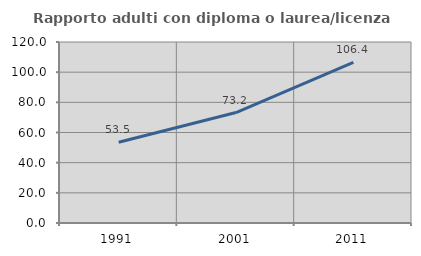
| Category | Rapporto adulti con diploma o laurea/licenza media  |
|---|---|
| 1991.0 | 53.526 |
| 2001.0 | 73.243 |
| 2011.0 | 106.427 |